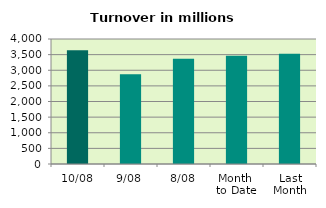
| Category | Series 0 |
|---|---|
| 10/08 | 3638.957 |
| 9/08 | 2873.73 |
| 8/08 | 3370.621 |
| Month 
to Date | 3467.464 |
| Last
Month | 3531.02 |